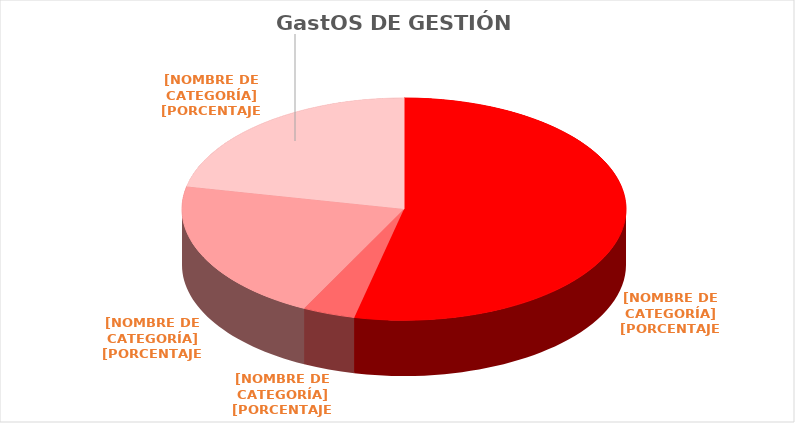
| Category | Series 0 |
|---|---|
| Web | 210.35 |
| Teléfono móvil | 15 |
| Material publicitario | 81.85 |
| Mantenimiento de cuentas bancarias | 85.28 |